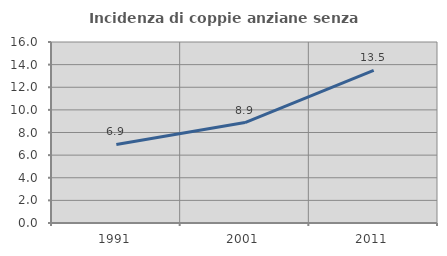
| Category | Incidenza di coppie anziane senza figli  |
|---|---|
| 1991.0 | 6.948 |
| 2001.0 | 8.88 |
| 2011.0 | 13.486 |